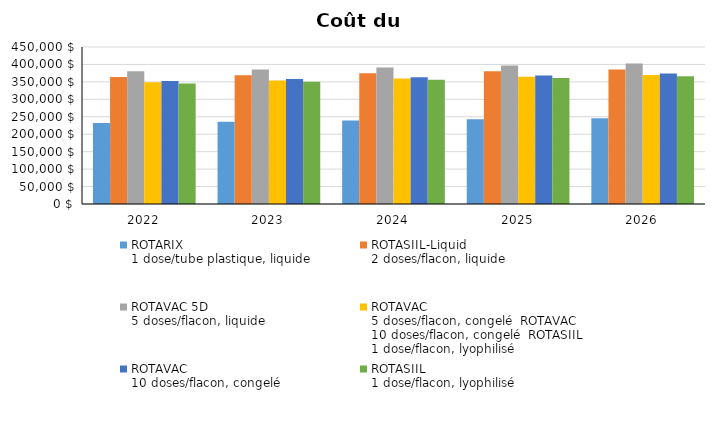
| Category | ROTARIX
1 dose/tube plastique, liquide | ROTASIIL-Liquid
2 doses/flacon, liquide | ROTAVAC 5D
5 doses/flacon, liquide | ROTAVAC
5 doses/flacon, congelé ROTAVAC
10 doses/flacon, congelé ROTASIIL
1 dose/flacon, lyophilisé | ROTAVAC
10 doses/flacon, congelé | ROTASIIL
1 dose/flacon, lyophilisé |
|---|---|---|---|---|---|---|
| 2022.0 | 232283.333 | 364075.385 | 380287.586 | 349228.421 | 352821.702 | 345710 |
| 2023.0 | 235659.967 | 369367.841 | 385815.714 | 354305.051 | 357950.567 | 350735.484 |
| 2024.0 | 239085.687 | 374737.232 | 391424.203 | 359455.479 | 363153.989 | 355834.022 |
| 2025.0 | 242561.205 | 380184.676 | 397114.221 | 364680.777 | 368433.051 | 361006.676 |
| 2026.0 | 246087.245 | 385711.309 | 402886.953 | 369982.034 | 373788.853 | 366254.523 |